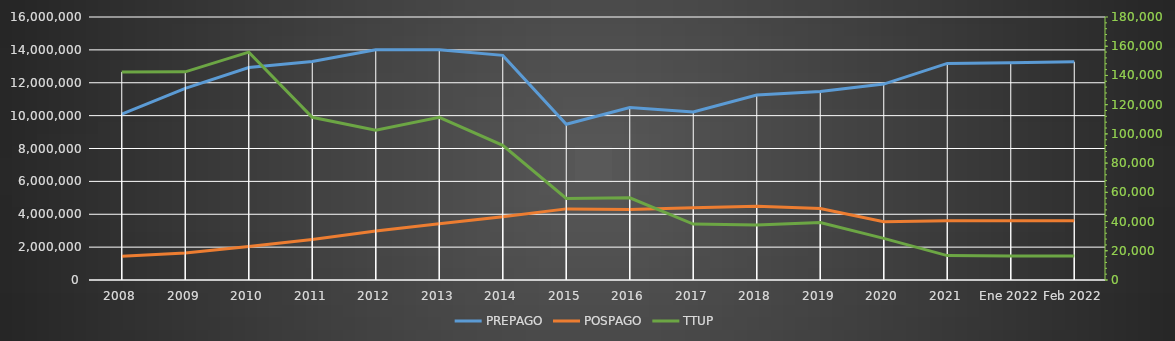
| Category | PREPAGO | POSPAGO |
|---|---|---|
| 2008 | 10097768 | 1452088 |
| 2009 | 11662294 | 1649838 |
| 2010 | 12929040 | 2033814 |
| 2011 | 13295834 | 2467378 |
| 2012 | 14008104 | 2976194 |
| 2013 | 14005126 | 3425277 |
| 2014 | 13666071 | 3846271 |
| 2015 | 9476240 | 4326937 |
| 2016 | 10498467 | 4293426 |
| 2017 | 10219457 | 4393703 |
| 2018 | 11254168 | 4480975 |
| 2019 | 11462048 | 4351686 |
| 2020 | 11917697 | 3539192 |
| 2021 | 13174530 | 3598383 |
| Ene 2022 | 13220510 | 3611202 |
| Feb 2022 | 13277237 | 3612124 |